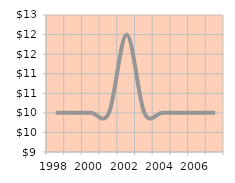
| Category | Total number 
of Establishments |
|---|---|
| 1998.0 | 10 |
| 1999.0 | 10 |
| 2000.0 | 10 |
| 2001.0 | 10 |
| 2002.0 | 12 |
| 2003.0 | 10 |
| 2004.0 | 10 |
| 2005.0 | 10 |
| 2006.0 | 10 |
| 2007.0 | 10 |